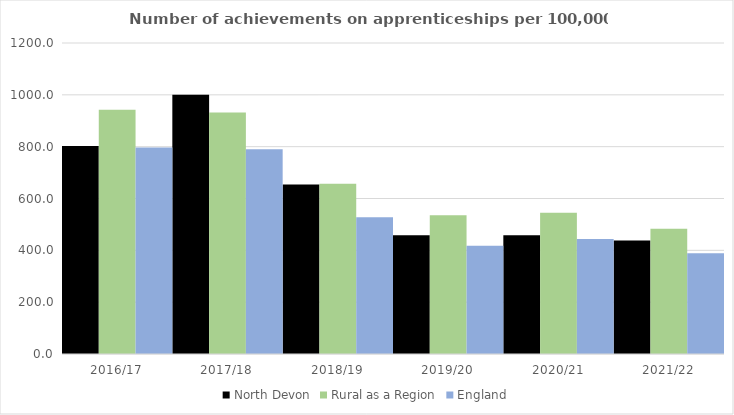
| Category | North Devon | Rural as a Region | England |
|---|---|---|---|
| 2016/17 | 803 | 942.594 | 797 |
| 2017/18 | 1000 | 931.709 | 790 |
| 2018/19 | 654 | 656.44 | 528 |
| 2019/20 | 458 | 535.552 | 418 |
| 2020/21 | 458 | 545.333 | 444 |
| 2021/22 | 438 | 482.936 | 389 |